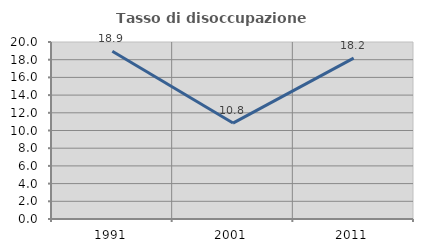
| Category | Tasso di disoccupazione giovanile  |
|---|---|
| 1991.0 | 18.947 |
| 2001.0 | 10.839 |
| 2011.0 | 18.182 |